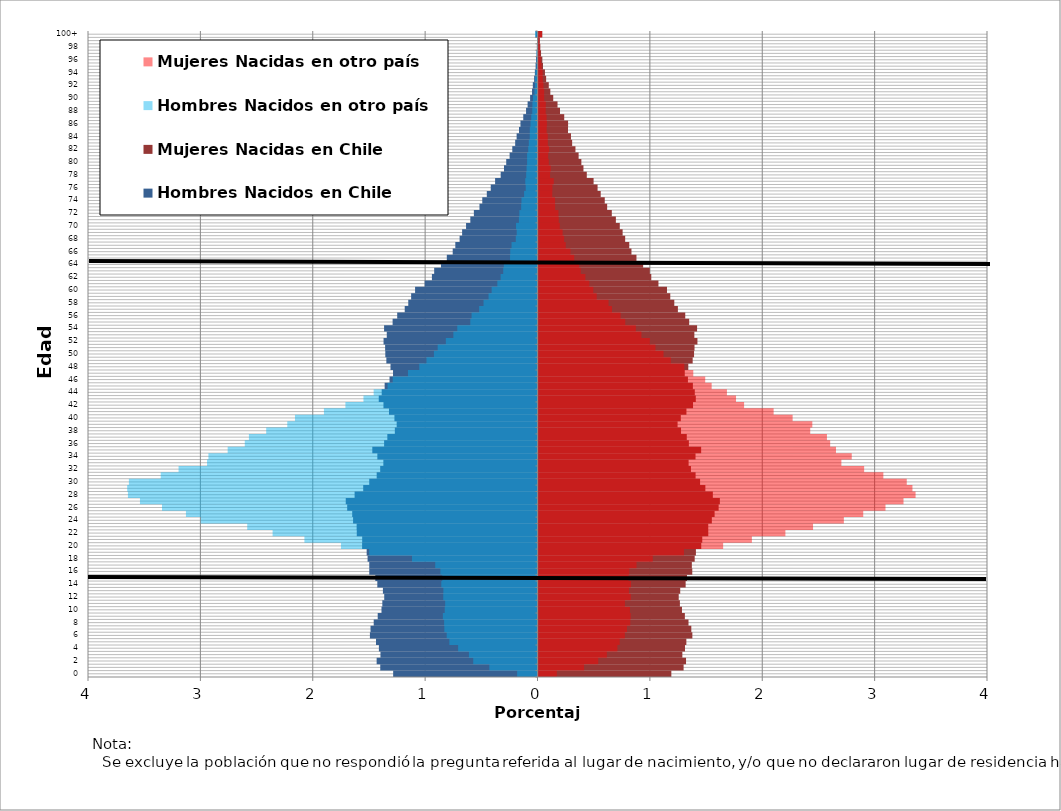
| Category | Hombres Nacidos en Chile | Mujeres Nacidas en Chile | Hombres Nacidos en otro país | Mujeres Nacidas en otro país |
|---|---|---|---|---|
| 0 | -1.284 | 1.182 | -0.181 | 0.163 |
| 1 | -1.399 | 1.291 | -0.428 | 0.406 |
| 2 | -1.431 | 1.313 | -0.572 | 0.531 |
| 3 | -1.398 | 1.28 | -0.61 | 0.608 |
| 4 | -1.411 | 1.304 | -0.706 | 0.702 |
| 5 | -1.437 | 1.316 | -0.784 | 0.723 |
| 6 | -1.491 | 1.369 | -0.808 | 0.768 |
| 7 | -1.486 | 1.36 | -0.829 | 0.787 |
| 8 | -1.458 | 1.335 | -0.831 | 0.817 |
| 9 | -1.422 | 1.302 | -0.842 | 0.82 |
| 10 | -1.388 | 1.277 | -0.825 | 0.814 |
| 11 | -1.381 | 1.258 | -0.822 | 0.769 |
| 12 | -1.364 | 1.248 | -0.839 | 0.821 |
| 13 | -1.376 | 1.261 | -0.838 | 0.805 |
| 14 | -1.425 | 1.309 | -0.856 | 0.823 |
| 15 | -1.443 | 1.321 | -0.847 | 0.801 |
| 16 | -1.497 | 1.368 | -0.864 | 0.809 |
| 17 | -1.497 | 1.365 | -0.91 | 0.872 |
| 18 | -1.512 | 1.39 | -1.117 | 1.017 |
| 19 | -1.52 | 1.401 | -1.498 | 1.294 |
| 20 | -1.561 | 1.448 | -1.749 | 1.643 |
| 21 | -1.56 | 1.457 | -2.074 | 1.899 |
| 22 | -1.608 | 1.511 | -2.357 | 2.197 |
| 23 | -1.609 | 1.511 | -2.583 | 2.443 |
| 24 | -1.641 | 1.542 | -2.997 | 2.717 |
| 25 | -1.649 | 1.567 | -3.129 | 2.89 |
| 26 | -1.694 | 1.603 | -3.342 | 3.088 |
| 27 | -1.706 | 1.614 | -3.538 | 3.248 |
| 28 | -1.628 | 1.551 | -3.645 | 3.355 |
| 29 | -1.551 | 1.485 | -3.651 | 3.328 |
| 30 | -1.497 | 1.438 | -3.636 | 3.277 |
| 31 | -1.431 | 1.398 | -3.353 | 3.069 |
| 32 | -1.4 | 1.357 | -3.194 | 2.898 |
| 33 | -1.372 | 1.336 | -2.941 | 2.695 |
| 34 | -1.425 | 1.397 | -2.928 | 2.788 |
| 35 | -1.47 | 1.447 | -2.757 | 2.647 |
| 36 | -1.365 | 1.338 | -2.605 | 2.596 |
| 37 | -1.336 | 1.319 | -2.568 | 2.567 |
| 38 | -1.27 | 1.268 | -2.414 | 2.418 |
| 39 | -1.253 | 1.238 | -2.227 | 2.437 |
| 40 | -1.273 | 1.266 | -2.158 | 2.261 |
| 41 | -1.322 | 1.316 | -1.901 | 2.092 |
| 42 | -1.371 | 1.375 | -1.709 | 1.829 |
| 43 | -1.413 | 1.4 | -1.549 | 1.758 |
| 44 | -1.386 | 1.391 | -1.458 | 1.677 |
| 45 | -1.36 | 1.374 | -1.334 | 1.541 |
| 46 | -1.317 | 1.33 | -1.289 | 1.484 |
| 47 | -1.286 | 1.302 | -1.153 | 1.377 |
| 48 | -1.308 | 1.333 | -1.052 | 1.298 |
| 49 | -1.345 | 1.372 | -0.988 | 1.177 |
| 50 | -1.354 | 1.384 | -0.922 | 1.112 |
| 51 | -1.356 | 1.388 | -0.888 | 1.041 |
| 52 | -1.37 | 1.414 | -0.815 | 0.991 |
| 53 | -1.341 | 1.387 | -0.748 | 0.916 |
| 54 | -1.365 | 1.411 | -0.714 | 0.866 |
| 55 | -1.289 | 1.341 | -0.598 | 0.772 |
| 56 | -1.249 | 1.306 | -0.586 | 0.731 |
| 57 | -1.182 | 1.24 | -0.519 | 0.654 |
| 58 | -1.15 | 1.208 | -0.48 | 0.623 |
| 59 | -1.124 | 1.173 | -0.435 | 0.518 |
| 60 | -1.089 | 1.143 | -0.408 | 0.488 |
| 61 | -1.004 | 1.067 | -0.357 | 0.453 |
| 62 | -0.94 | 1.004 | -0.328 | 0.417 |
| 63 | -0.919 | 0.991 | -0.305 | 0.376 |
| 64 | -0.859 | 0.931 | -0.3 | 0.362 |
| 65 | -0.807 | 0.872 | -0.244 | 0.318 |
| 66 | -0.755 | 0.827 | -0.242 | 0.284 |
| 67 | -0.731 | 0.808 | -0.231 | 0.242 |
| 68 | -0.693 | 0.771 | -0.193 | 0.228 |
| 69 | -0.671 | 0.749 | -0.185 | 0.214 |
| 70 | -0.636 | 0.723 | -0.191 | 0.189 |
| 71 | -0.598 | 0.688 | -0.165 | 0.18 |
| 72 | -0.566 | 0.652 | -0.161 | 0.178 |
| 73 | -0.516 | 0.611 | -0.145 | 0.148 |
| 74 | -0.492 | 0.59 | -0.142 | 0.147 |
| 75 | -0.451 | 0.554 | -0.119 | 0.123 |
| 76 | -0.416 | 0.526 | -0.105 | 0.124 |
| 77 | -0.377 | 0.49 | -0.109 | 0.136 |
| 78 | -0.328 | 0.43 | -0.101 | 0.103 |
| 79 | -0.298 | 0.4 | -0.097 | 0.108 |
| 80 | -0.278 | 0.381 | -0.092 | 0.091 |
| 81 | -0.248 | 0.357 | -0.093 | 0.086 |
| 82 | -0.224 | 0.329 | -0.083 | 0.095 |
| 83 | -0.199 | 0.299 | -0.077 | 0.083 |
| 84 | -0.186 | 0.289 | -0.069 | 0.082 |
| 85 | -0.165 | 0.263 | -0.068 | 0.072 |
| 86 | -0.152 | 0.263 | -0.063 | 0.075 |
| 87 | -0.127 | 0.229 | -0.056 | 0.072 |
| 88 | -0.102 | 0.191 | -0.046 | 0.064 |
| 89 | -0.088 | 0.169 | -0.045 | 0.065 |
| 90 | -0.066 | 0.131 | -0.04 | 0.051 |
| 91 | -0.049 | 0.105 | -0.027 | 0.05 |
| 92 | -0.042 | 0.091 | -0.022 | 0.044 |
| 93 | -0.03 | 0.068 | -0.022 | 0.038 |
| 94 | -0.024 | 0.057 | -0.02 | 0.037 |
| 95 | -0.017 | 0.04 | -0.01 | 0.027 |
| 96 | -0.013 | 0.034 | -0.008 | 0.02 |
| 97 | -0.008 | 0.023 | -0.009 | 0.015 |
| 98 | -0.006 | 0.016 | -0.004 | 0.011 |
| 99 | -0.004 | 0.013 | -0.004 | 0.006 |
| 100+ | -0.018 | 0.034 | -0.022 | 0.032 |